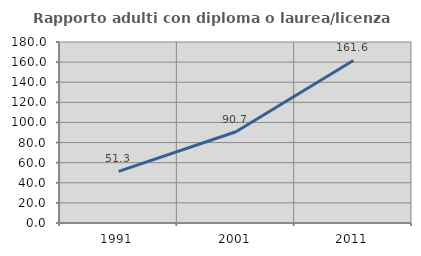
| Category | Rapporto adulti con diploma o laurea/licenza media  |
|---|---|
| 1991.0 | 51.269 |
| 2001.0 | 90.735 |
| 2011.0 | 161.632 |